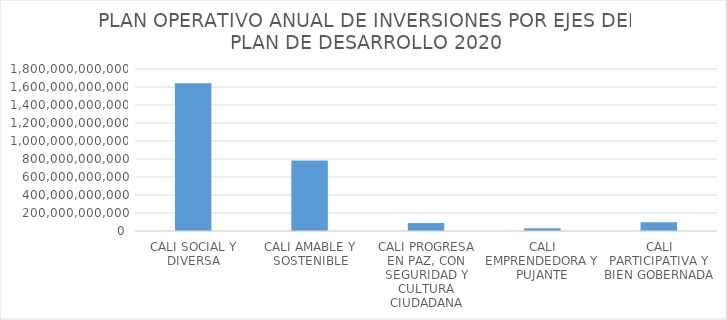
| Category | VALOR (Pesos) |
|---|---|
| CALI SOCIAL Y DIVERSA | 1642954810789 |
| CALI AMABLE Y SOSTENIBLE | 784374048549 |
| CALI PROGRESA EN PAZ, CON SEGURIDAD Y CULTURA CIUDADANA | 89124460279 |
| CALI EMPRENDEDORA Y PUJANTE | 31762049253 |
| CALI PARTICIPATIVA Y BIEN GOBERNADA | 96054155747 |